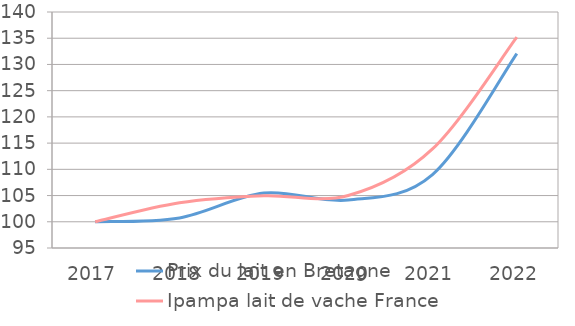
| Category | Prix du lait en Bretagne | Ipampa lait de vache France |
|---|---|---|
| 2017.0 | 100 | 100 |
| 2018.0 | 100.739 | 103.62 |
| 2019.0 | 105.472 | 104.964 |
| 2020.0 | 104.141 | 104.997 |
| 2021.0 | 109.011 | 113.884 |
| 2022.0 | 132.076 | 135.201 |